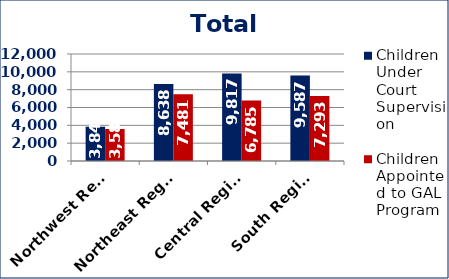
| Category | Children Under Court Supervision  | Children Appointed to GAL Program  |
|---|---|---|
| Northwest Region | 3845 | 3586 |
| Northeast Region | 8638 | 7481 |
| Central Region | 9817 | 6785 |
| South Region | 9587 | 7293 |